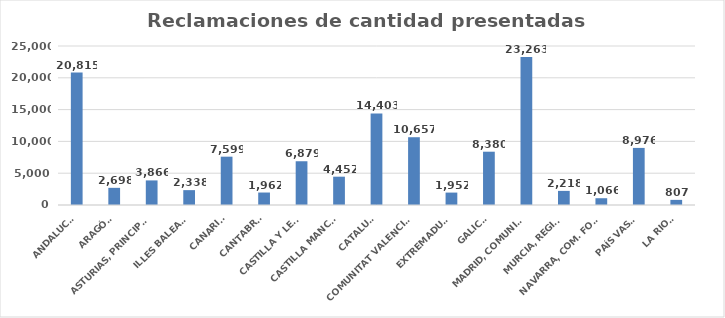
| Category | Series 0 |
|---|---|
| ANDALUCÍA | 20815 |
| ARAGÓN | 2698 |
| ASTURIAS, PRINCIPADO | 3866 |
| ILLES BALEARS | 2338 |
| CANARIAS | 7599 |
| CANTABRIA | 1962 |
| CASTILLA Y LEÓN | 6879 |
| CASTILLA MANCHA | 4452 |
| CATALUÑA | 14403 |
| COMUNITAT VALENCIANA | 10657 |
| EXTREMADURA | 1952 |
| GALICIA | 8380 |
| MADRID, COMUNIDAD | 23263 |
| MURCIA, REGIÓN | 2218 |
| NAVARRA, COM. FORAL | 1066 |
| PAÍS VASCO | 8976 |
| LA RIOJA | 807 |